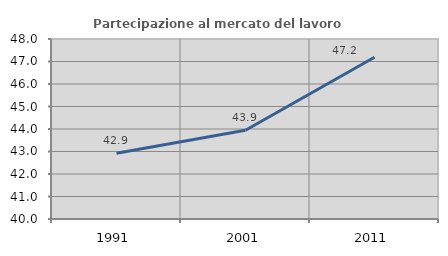
| Category | Partecipazione al mercato del lavoro  femminile |
|---|---|
| 1991.0 | 42.926 |
| 2001.0 | 43.946 |
| 2011.0 | 47.191 |